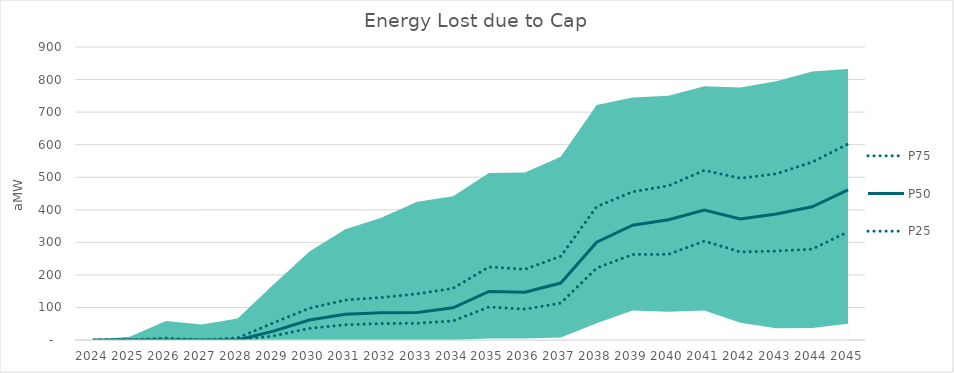
| Category | P75 | P50 | P25 |
|---|---|---|---|
| 2024.0 | 0 | 0 | 0 |
| 2025.0 | 0 | 0 | 0 |
| 2026.0 | 5.698 | 0 | 0 |
| 2027.0 | 0 | 0 | 0 |
| 2028.0 | 6.221 | 0 | 0 |
| 2029.0 | 52.858 | 27.165 | 12.658 |
| 2030.0 | 97.443 | 61.329 | 35.566 |
| 2031.0 | 122.784 | 78.98 | 46.867 |
| 2032.0 | 130.582 | 83.699 | 50.469 |
| 2033.0 | 141.772 | 84.783 | 51.36 |
| 2034.0 | 158.658 | 98.864 | 58.62 |
| 2035.0 | 224.372 | 149.241 | 101.349 |
| 2036.0 | 217.057 | 146.7 | 94.664 |
| 2037.0 | 257.205 | 174.934 | 113.428 |
| 2038.0 | 409.629 | 300.517 | 221.117 |
| 2039.0 | 455.451 | 352.503 | 262.565 |
| 2040.0 | 473.673 | 369.593 | 263.161 |
| 2041.0 | 521.194 | 399.246 | 303.871 |
| 2042.0 | 496.906 | 371.615 | 270.501 |
| 2043.0 | 510.394 | 386.925 | 273.251 |
| 2044.0 | 546.398 | 409.085 | 279.032 |
| 2045.0 | 602.099 | 461.26 | 332.451 |